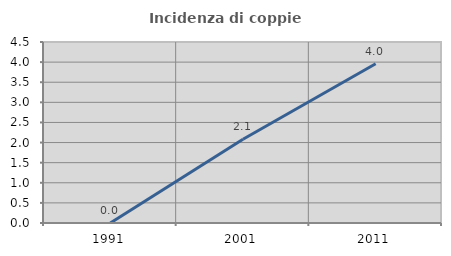
| Category | Incidenza di coppie miste |
|---|---|
| 1991.0 | 0 |
| 2001.0 | 2.083 |
| 2011.0 | 3.96 |